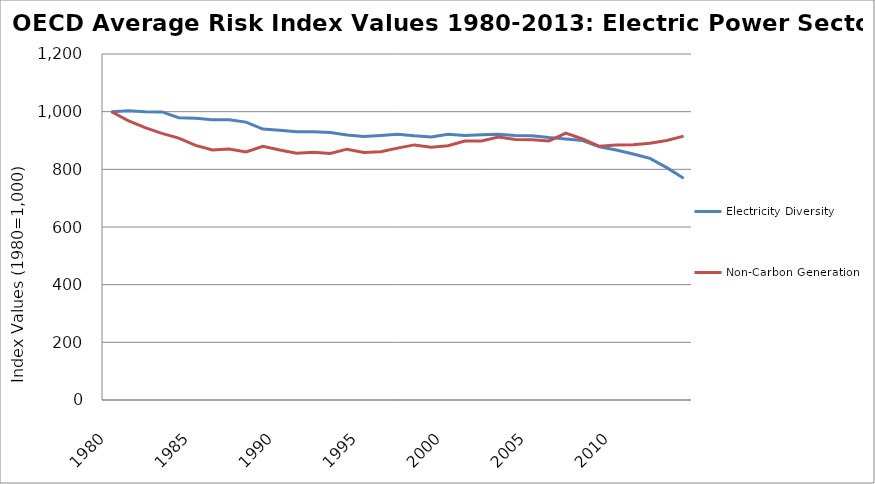
| Category | Electricity Diversity | Non-Carbon Generation |
|---|---|---|
| 1980.0 | 1000 | 1000 |
| 1981.0 | 1003.437 | 968.588 |
| 1982.0 | 999.644 | 944.553 |
| 1983.0 | 999.063 | 924.666 |
| 1984.0 | 979.143 | 908.496 |
| 1985.0 | 977.499 | 883.161 |
| 1986.0 | 971.845 | 867.103 |
| 1987.0 | 972.197 | 870.539 |
| 1988.0 | 963.85 | 860.34 |
| 1989.0 | 939.77 | 879.896 |
| 1990.0 | 935.858 | 867.131 |
| 1991.0 | 930.139 | 855.466 |
| 1992.0 | 930.292 | 859.233 |
| 1993.0 | 927.944 | 855.314 |
| 1994.0 | 919.172 | 869.947 |
| 1995.0 | 913.746 | 858.671 |
| 1996.0 | 917.626 | 860.743 |
| 1997.0 | 921.88 | 873.64 |
| 1998.0 | 916.291 | 884.737 |
| 1999.0 | 912.299 | 876.911 |
| 2000.0 | 921.933 | 882.056 |
| 2001.0 | 917.593 | 898.425 |
| 2002.0 | 920.131 | 898.408 |
| 2003.0 | 921.425 | 911.907 |
| 2004.0 | 916.94 | 903.538 |
| 2005.0 | 916.445 | 902.706 |
| 2006.0 | 910.374 | 898.625 |
| 2007.0 | 905.607 | 925.499 |
| 2008.0 | 899.678 | 905.133 |
| 2009.0 | 878.466 | 879.899 |
| 2010.0 | 867.199 | 884.276 |
| 2011.0 | 852.953 | 885.667 |
| 2012.0 | 838.143 | 890.572 |
| 2013.0 | 805.958 | 900.21 |
| 2014.0 | 769.181 | 915.025 |